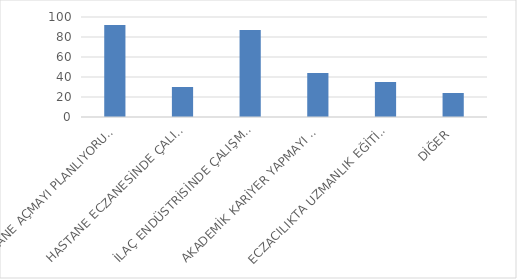
| Category | Series 0 |
|---|---|
| ECZANE AÇMAYI PLANLIYORUM. | 92 |
| HASTANE ECZANESİNDE ÇALIŞMAYI PLANLIYORUM. | 30 |
| İLAÇ ENDÜSTRİSİNDE ÇALIŞMAYI PLANLIYORUM. | 87 |
| AKADEMİK KARİYER YAPMAYI PLANLIYORUM. | 44 |
| ECZACILIKTA UZMANLIK EĞİTİMİNE DEVAM ETMEYİ PLANLIYORUM. | 35 |
| DİĞER | 24 |